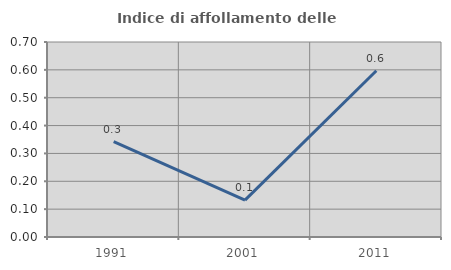
| Category | Indice di affollamento delle abitazioni  |
|---|---|
| 1991.0 | 0.343 |
| 2001.0 | 0.132 |
| 2011.0 | 0.597 |